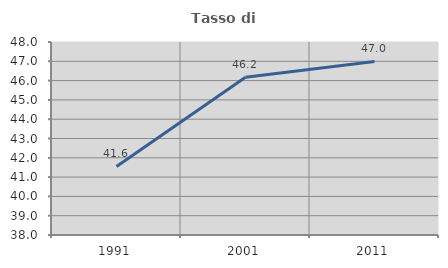
| Category | Tasso di occupazione   |
|---|---|
| 1991.0 | 41.553 |
| 2001.0 | 46.175 |
| 2011.0 | 46.994 |